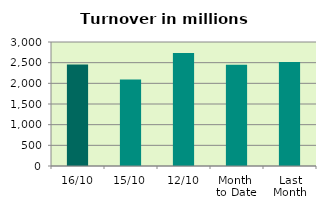
| Category | Series 0 |
|---|---|
| 16/10 | 2453.566 |
| 15/10 | 2091.222 |
| 12/10 | 2735.086 |
| Month 
to Date | 2451.559 |
| Last
Month | 2513.15 |